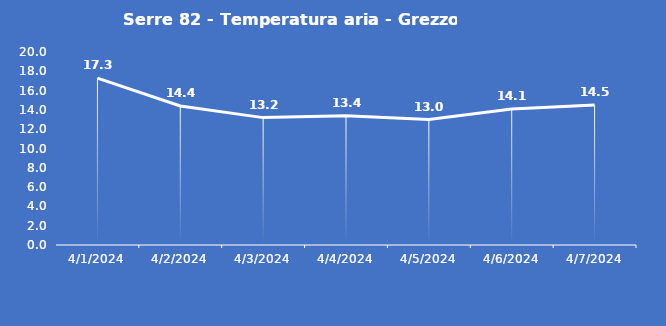
| Category | Serre 82 - Temperatura aria - Grezzo (°C) |
|---|---|
| 4/1/24 | 17.3 |
| 4/2/24 | 14.4 |
| 4/3/24 | 13.2 |
| 4/4/24 | 13.4 |
| 4/5/24 | 13 |
| 4/6/24 | 14.1 |
| 4/7/24 | 14.5 |